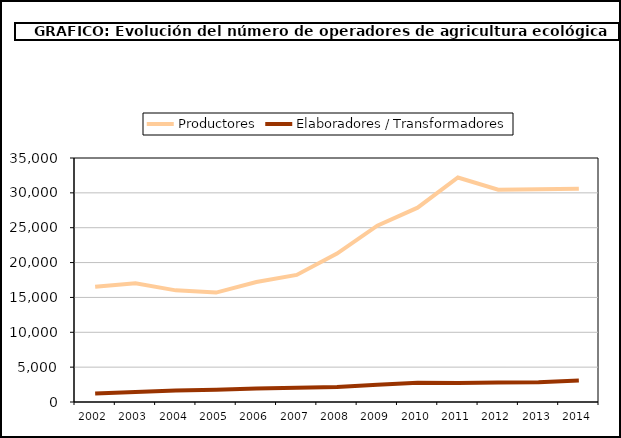
| Category | Productores | Elaboradores / Transformadores |
|---|---|---|
| 2002.0 | 16521 | 1204 |
| 2003.0 | 17028 | 1439 |
| 2004.0 | 16013 | 1635 |
| 2005.0 | 15693 | 1764 |
| 2006.0 | 17214 | 1942 |
| 2007.0 | 18226 | 2061 |
| 2008.0 | 21291 | 2168 |
| 2009.0 | 25291 | 2465 |
| 2010.0 | 27877 | 2747 |
| 2011.0 | 32206 | 2729 |
| 2012.0 | 30462 | 2790 |
| 2013.0 | 30502 | 2842 |
| 2014.0 | 30602 | 3082 |